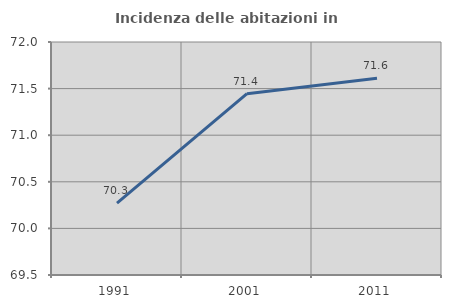
| Category | Incidenza delle abitazioni in proprietà  |
|---|---|
| 1991.0 | 70.272 |
| 2001.0 | 71.445 |
| 2011.0 | 71.61 |